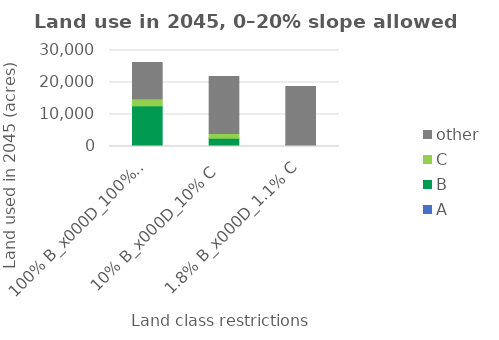
| Category | A | B | C | other |
|---|---|---|---|---|
| 100% B_x000d_100% C | 0 | 12695.868 | 2239.378 | 11347.489 |
| 10% B_x000d_10% C | 0 | 2586.153 | 1496.751 | 17791.695 |
| 1.8% B_x000d_1.1% C | 0 | 465.507 | 164.643 | 18101.565 |